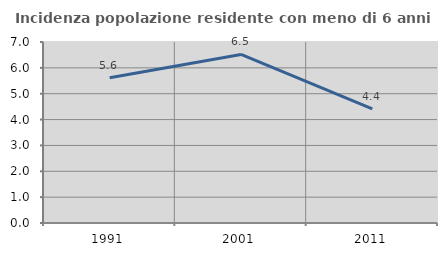
| Category | Incidenza popolazione residente con meno di 6 anni |
|---|---|
| 1991.0 | 5.616 |
| 2001.0 | 6.517 |
| 2011.0 | 4.417 |